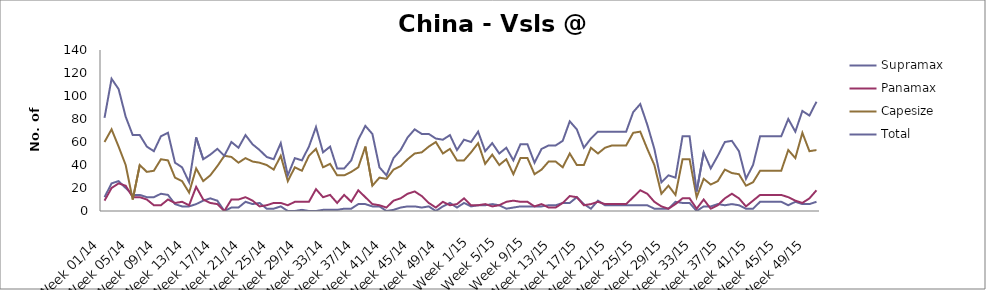
| Category | Supramax | Panamax | Capesize | Total |
|---|---|---|---|---|
| Week 01/14 | 12 | 9 | 60 | 81 |
| Week 02/14 | 24 | 20 | 71 | 115 |
| Week 03/14 | 26 | 24 | 56 | 106 |
| Week 04/14 | 20 | 22 | 40 | 82 |
| Week 05/14 | 14 | 12 | 10 | 66 |
| Week 06/14 | 14 | 12 | 40 | 66 |
| Week 07/14 | 12 | 10 | 34 | 56 |
| Week 08/14 | 12 | 5 | 35 | 52 |
| Week 09/14 | 15 | 5 | 45 | 65 |
| Week 10/14 | 14 | 10 | 44 | 68 |
| Week 11/14 | 6 | 7 | 29 | 42 |
| Week 12/14 | 4 | 8 | 26 | 38 |
| Week 13/14 | 4 | 5 | 16 | 25 |
| Week 14/14 | 6 | 21 | 37 | 64 |
| Week 15/14 | 9 | 10 | 26 | 45 |
| Week 16/14 | 11 | 7 | 31 | 49 |
| Week 17/14 | 9 | 6 | 39 | 54 |
| Week 18/14 | 0 | 0 | 48 | 48 |
| Week 19/14 | 3 | 10 | 47 | 60 |
| Week 20/14 | 3 | 10 | 42 | 55 |
| Week 21/14 | 8 | 12 | 46 | 66 |
| Week 22/14 | 6 | 9 | 43 | 58 |
| Week 23/14 | 7 | 4 | 42 | 53 |
| Week 24/14 | 2 | 5 | 40 | 47 |
| Week 25/14 | 2 | 7 | 36 | 45 |
| Week 26/14 | 4 | 7 | 48 | 59 |
| Week 27/14 | 0 | 5 | 26 | 31 |
| Week 28/14 | 0 | 8 | 38 | 46 |
| Week 29/14 | 1 | 8 | 35 | 44 |
| Week 30/14 | 0 | 8 | 48 | 56 |
| Week 31/14 | 0 | 19 | 54 | 73 |
| Week 32/14 | 1 | 12 | 38 | 51 |
| Week 33/14 | 1 | 14 | 41 | 56 |
| Week 34/14 | 1 | 7 | 31 | 37 |
| Week 35/14 | 2 | 14 | 31 | 37 |
| Week 36/14 | 2 | 8 | 34 | 44 |
| Week 37/14 | 6 | 18 | 38 | 62 |
| Week 38/14 | 6 | 12 | 56 | 74 |
| Week 39/14 | 4 | 6 | 22 | 67 |
| Week 40/14 | 4 | 5 | 29 | 38 |
| Week 41/14 | 0 | 3 | 28 | 31 |
| Week 42/14 | 1 | 9 | 36 | 46 |
| Week 43/14 | 3 | 11 | 39 | 53 |
| Week 44/14 | 4 | 15 | 45 | 64 |
| Week 45/14 | 4 | 17 | 50 | 71 |
| Week 46/14 | 3 | 13 | 51 | 67 |
| Week 47/14 | 4 | 7 | 56 | 67 |
| Week 48/14 | 0 | 3 | 60 | 63 |
| Week 49/14 | 4 | 8 | 50 | 62 |
| Week 50/14 | 7 | 5 | 54 | 66 |
| Week 51/14 | 3 | 6 | 44 | 53 |
| Week 52/14 | 7 | 11 | 44 | 62 |
| Week 1/15 | 4 | 5 | 51 | 60 |
| Week 2/15 | 5 | 5 | 59 | 69 |
| Week 3/15 | 5 | 6 | 41 | 52 |
| Week 4/15 | 6 | 4 | 49 | 59 |
| Week 5/15 | 5 | 5 | 40 | 50 |
| Week 6/15 | 2 | 8 | 45 | 55 |
| Week 7/15 | 3 | 9 | 32 | 44 |
| Week 8/15 | 4 | 8 | 46 | 58 |
| Week 9/15 | 4 | 8 | 46 | 58 |
| Week 10/15 | 4 | 4 | 32 | 42 |
| Week 11/15 | 4 | 6 | 36 | 54 |
| Week 12/15 | 5 | 3 | 43 | 57 |
| Week 13/15 | 5 | 3 | 43 | 57 |
| Week 14/15 | 7 | 7 | 38 | 61 |
| Week 15/15 | 7 | 13 | 50 | 78 |
| Week 16/15 | 12 | 12 | 40 | 71 |
| Week 17/15 | 6 | 5 | 40 | 55 |
| Week 18/15 | 2 | 6 | 55 | 63 |
| Week 19/15 | 9 | 8 | 50 | 69 |
| Week 20/15 | 5 | 6 | 55 | 69 |
| Week 21/15 | 5 | 6 | 57 | 69 |
| Week 22/15 | 5 | 6 | 57 | 69 |
| Week 23/15 | 5 | 6 | 57 | 69 |
| Week 24/15 | 5 | 12 | 68 | 86 |
| Week 25/15 | 5 | 18 | 69 | 93 |
| Week 26/15 | 5 | 15 | 54 | 75 |
| Week 27/15 | 2 | 8 | 40 | 54 |
| Week 28/15 | 2 | 4 | 15 | 25 |
| Week 29/15 | 2 | 2 | 22 | 31 |
| Week 30/15 | 8 | 6 | 14 | 29 |
| Week 31/15 | 7 | 11 | 45 | 65 |
| Week 32/15 | 7 | 11 | 45 | 65 |
| Week 33/15 | 0 | 2 | 12 | 17 |
| Week 34/15 | 4 | 10 | 28 | 51 |
| Week 35/15 | 4 | 2 | 23 | 37 |
| Week 36/15 | 6 | 5 | 26 | 48 |
| Week 37/15 | 5 | 11 | 36 | 60 |
| Week 38/15 | 6 | 15 | 33 | 61 |
| Week 39/15 | 5 | 11 | 32 | 52 |
| Week 40/15 | 2 | 4 | 22 | 28 |
| Week 41/15 | 2 | 9 | 25 | 40 |
| Week 42/15 | 8 | 14 | 35 | 65 |
| Week 43/15 | 8 | 14 | 35 | 65 |
| Week 44/15 | 8 | 14 | 35 | 65 |
| Week 45/15 | 8 | 14 | 35 | 65 |
| Week 46/15 | 5 | 12 | 53 | 80 |
| Week 47/15 | 8 | 9 | 46 | 69 |
| Week 48/15 | 6 | 7 | 68 | 87 |
| Week 49/15 | 6 | 11 | 52 | 83 |
| Week 50/15 | 8 | 18 | 53 | 95 |